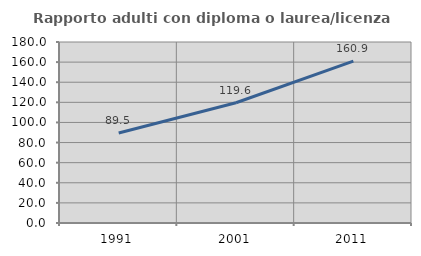
| Category | Rapporto adulti con diploma o laurea/licenza media  |
|---|---|
| 1991.0 | 89.465 |
| 2001.0 | 119.557 |
| 2011.0 | 160.937 |